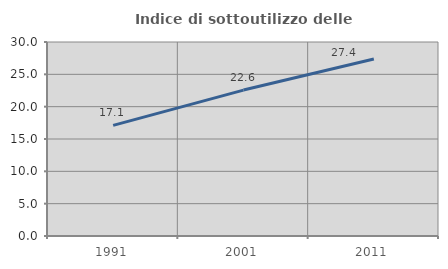
| Category | Indice di sottoutilizzo delle abitazioni  |
|---|---|
| 1991.0 | 17.101 |
| 2001.0 | 22.565 |
| 2011.0 | 27.364 |